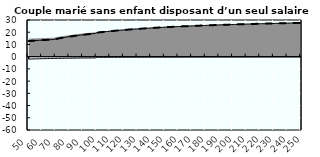
| Category | Coin fiscal moyen (somme des composantes) | Taux moyen d'imposition net en % du salaire brut |
|---|---|---|
| 50.0 | 12.74 | 12.74 |
| 51.0 | 12.833 | 12.833 |
| 52.0 | 12.923 | 12.923 |
| 53.0 | 13.009 | 13.009 |
| 54.0 | 13.093 | 13.093 |
| 55.0 | 13.173 | 13.173 |
| 56.0 | 13.25 | 13.25 |
| 57.0 | 13.325 | 13.325 |
| 58.0 | 13.397 | 13.397 |
| 59.0 | 13.466 | 13.466 |
| 60.0 | 13.533 | 13.533 |
| 61.0 | 13.598 | 13.598 |
| 62.0 | 13.661 | 13.661 |
| 63.0 | 13.722 | 13.722 |
| 64.0 | 13.781 | 13.781 |
| 65.0 | 13.838 | 13.838 |
| 66.0 | 13.894 | 13.894 |
| 67.0 | 13.948 | 13.948 |
| 68.0 | 14 | 14 |
| 69.0 | 14.232 | 14.232 |
| 70.0 | 14.457 | 14.457 |
| 71.0 | 14.676 | 14.676 |
| 72.0 | 14.889 | 14.889 |
| 73.0 | 15.096 | 15.096 |
| 74.0 | 15.297 | 15.297 |
| 75.0 | 15.493 | 15.493 |
| 76.0 | 15.684 | 15.684 |
| 77.0 | 15.87 | 15.87 |
| 78.0 | 16.051 | 16.051 |
| 79.0 | 16.228 | 16.228 |
| 80.0 | 16.4 | 16.4 |
| 81.0 | 16.568 | 16.568 |
| 82.0 | 16.732 | 16.732 |
| 83.0 | 16.892 | 16.892 |
| 84.0 | 17.048 | 17.048 |
| 85.0 | 17.2 | 17.2 |
| 86.0 | 17.349 | 17.349 |
| 87.0 | 17.494 | 17.494 |
| 88.0 | 17.636 | 17.636 |
| 89.0 | 17.775 | 17.775 |
| 90.0 | 17.911 | 17.911 |
| 91.0 | 18.044 | 18.044 |
| 92.0 | 18.174 | 18.174 |
| 93.0 | 18.301 | 18.301 |
| 94.0 | 18.425 | 18.425 |
| 95.0 | 18.547 | 18.547 |
| 96.0 | 18.667 | 18.667 |
| 97.0 | 18.783 | 18.783 |
| 98.0 | 18.898 | 18.898 |
| 99.0 | 19.01 | 19.01 |
| 100.0 | 19.641 | 19.641 |
| 101.0 | 19.773 | 19.773 |
| 102.0 | 19.903 | 19.903 |
| 103.0 | 20.03 | 20.03 |
| 104.0 | 20.155 | 20.155 |
| 105.0 | 20.277 | 20.277 |
| 106.0 | 20.397 | 20.397 |
| 107.0 | 20.515 | 20.515 |
| 108.0 | 20.63 | 20.63 |
| 109.0 | 20.744 | 20.744 |
| 110.0 | 20.855 | 20.855 |
| 111.0 | 20.965 | 20.965 |
| 112.0 | 21.072 | 21.072 |
| 113.0 | 21.178 | 21.178 |
| 114.0 | 21.281 | 21.281 |
| 115.0 | 21.383 | 21.383 |
| 116.0 | 21.483 | 21.483 |
| 117.0 | 21.582 | 21.582 |
| 118.0 | 21.679 | 21.679 |
| 119.0 | 21.774 | 21.774 |
| 120.0 | 21.867 | 21.867 |
| 121.0 | 21.959 | 21.959 |
| 122.0 | 22.05 | 22.05 |
| 123.0 | 22.139 | 22.139 |
| 124.0 | 22.226 | 22.226 |
| 125.0 | 22.313 | 22.313 |
| 126.0 | 22.397 | 22.397 |
| 127.0 | 22.481 | 22.481 |
| 128.0 | 22.563 | 22.563 |
| 129.0 | 22.644 | 22.644 |
| 130.0 | 22.724 | 22.724 |
| 131.0 | 22.802 | 22.802 |
| 132.0 | 22.879 | 22.879 |
| 133.0 | 22.955 | 22.955 |
| 134.0 | 23.03 | 23.03 |
| 135.0 | 23.104 | 23.104 |
| 136.0 | 23.177 | 23.177 |
| 137.0 | 23.249 | 23.249 |
| 138.0 | 23.319 | 23.319 |
| 139.0 | 23.389 | 23.389 |
| 140.0 | 23.458 | 23.458 |
| 141.0 | 23.525 | 23.525 |
| 142.0 | 23.592 | 23.592 |
| 143.0 | 23.658 | 23.658 |
| 144.0 | 23.723 | 23.723 |
| 145.0 | 23.787 | 23.787 |
| 146.0 | 23.85 | 23.85 |
| 147.0 | 23.912 | 23.912 |
| 148.0 | 23.974 | 23.974 |
| 149.0 | 24.034 | 24.034 |
| 150.0 | 24.094 | 24.094 |
| 151.0 | 24.153 | 24.153 |
| 152.0 | 24.211 | 24.211 |
| 153.0 | 24.268 | 24.268 |
| 154.0 | 24.325 | 24.325 |
| 155.0 | 24.381 | 24.381 |
| 156.0 | 24.436 | 24.436 |
| 157.0 | 24.491 | 24.491 |
| 158.0 | 24.545 | 24.545 |
| 159.0 | 24.598 | 24.598 |
| 160.0 | 24.65 | 24.65 |
| 161.0 | 24.702 | 24.702 |
| 162.0 | 24.754 | 24.754 |
| 163.0 | 24.804 | 24.804 |
| 164.0 | 24.854 | 24.854 |
| 165.0 | 24.904 | 24.904 |
| 166.0 | 24.952 | 24.952 |
| 167.0 | 25 | 25 |
| 168.0 | 25.048 | 25.048 |
| 169.0 | 25.095 | 25.095 |
| 170.0 | 25.142 | 25.142 |
| 171.0 | 25.188 | 25.188 |
| 172.0 | 25.233 | 25.233 |
| 173.0 | 25.278 | 25.278 |
| 174.0 | 25.322 | 25.322 |
| 175.0 | 25.366 | 25.366 |
| 176.0 | 25.41 | 25.41 |
| 177.0 | 25.452 | 25.452 |
| 178.0 | 25.495 | 25.495 |
| 179.0 | 25.537 | 25.537 |
| 180.0 | 25.578 | 25.578 |
| 181.0 | 25.619 | 25.619 |
| 182.0 | 25.66 | 25.66 |
| 183.0 | 25.7 | 25.7 |
| 184.0 | 25.74 | 25.74 |
| 185.0 | 25.779 | 25.779 |
| 186.0 | 25.818 | 25.818 |
| 187.0 | 25.856 | 25.856 |
| 188.0 | 25.894 | 25.894 |
| 189.0 | 25.932 | 25.932 |
| 190.0 | 25.969 | 25.969 |
| 191.0 | 26.006 | 26.006 |
| 192.0 | 26.042 | 26.042 |
| 193.0 | 26.078 | 26.078 |
| 194.0 | 26.114 | 26.114 |
| 195.0 | 26.149 | 26.149 |
| 196.0 | 26.184 | 26.184 |
| 197.0 | 26.219 | 26.219 |
| 198.0 | 26.253 | 26.253 |
| 199.0 | 26.287 | 26.287 |
| 200.0 | 26.32 | 26.32 |
| 201.0 | 26.354 | 26.354 |
| 202.0 | 26.387 | 26.387 |
| 203.0 | 26.419 | 26.419 |
| 204.0 | 26.451 | 26.451 |
| 205.0 | 26.483 | 26.483 |
| 206.0 | 26.515 | 26.515 |
| 207.0 | 26.546 | 26.546 |
| 208.0 | 26.577 | 26.577 |
| 209.0 | 26.608 | 26.608 |
| 210.0 | 26.638 | 26.638 |
| 211.0 | 26.669 | 26.669 |
| 212.0 | 26.698 | 26.698 |
| 213.0 | 26.728 | 26.728 |
| 214.0 | 26.757 | 26.757 |
| 215.0 | 26.786 | 26.786 |
| 216.0 | 26.815 | 26.815 |
| 217.0 | 26.844 | 26.844 |
| 218.0 | 26.872 | 26.872 |
| 219.0 | 26.9 | 26.9 |
| 220.0 | 26.928 | 26.928 |
| 221.0 | 26.955 | 26.955 |
| 222.0 | 26.982 | 26.982 |
| 223.0 | 27.009 | 27.009 |
| 224.0 | 27.036 | 27.036 |
| 225.0 | 27.063 | 27.063 |
| 226.0 | 27.089 | 27.089 |
| 227.0 | 27.115 | 27.115 |
| 228.0 | 27.141 | 27.141 |
| 229.0 | 27.166 | 27.166 |
| 230.0 | 27.192 | 27.192 |
| 231.0 | 27.217 | 27.217 |
| 232.0 | 27.242 | 27.242 |
| 233.0 | 27.266 | 27.266 |
| 234.0 | 27.291 | 27.291 |
| 235.0 | 27.315 | 27.315 |
| 236.0 | 27.339 | 27.339 |
| 237.0 | 27.363 | 27.363 |
| 238.0 | 27.387 | 27.387 |
| 239.0 | 27.41 | 27.41 |
| 240.0 | 27.434 | 27.434 |
| 241.0 | 27.457 | 27.457 |
| 242.0 | 27.48 | 27.48 |
| 243.0 | 27.502 | 27.502 |
| 244.0 | 27.525 | 27.525 |
| 245.0 | 27.547 | 27.547 |
| 246.0 | 27.569 | 27.569 |
| 247.0 | 27.591 | 27.591 |
| 248.0 | 27.613 | 27.613 |
| 249.0 | 27.635 | 27.635 |
| 250.0 | 27.656 | 27.656 |